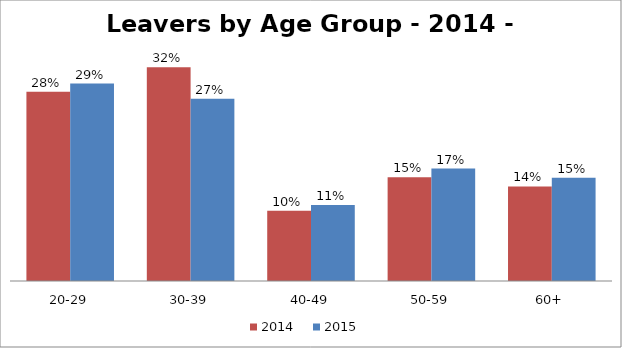
| Category | 2014
 | 2015
 |
|---|---|---|
| 20-29 | 0.282 | 0.294 |
| 30-39 | 0.318 | 0.271 |
| 40-49 | 0.105 | 0.113 |
| 50-59 | 0.155 | 0.167 |
| 60+ | 0.141 | 0.154 |